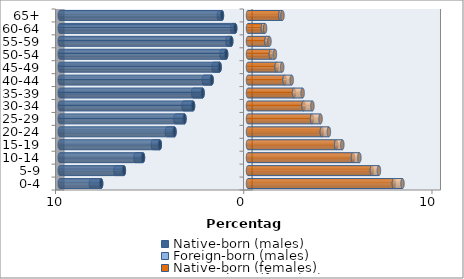
| Category | Native-born (males) | Foreign-born (males) | Native-born (females) | Foreign-born (females) |
|---|---|---|---|---|
| 0-4 | -7.802 | -0.546 | 7.749 | 0.458 |
| 5-9 | -6.594 | -0.447 | 6.578 | 0.377 |
| 10-14 | -5.58 | -0.4 | 5.576 | 0.341 |
| 15-19 | -4.685 | -0.369 | 4.684 | 0.328 |
| 20-24 | -3.905 | -0.405 | 3.922 | 0.376 |
| 25-29 | -3.375 | -0.482 | 3.402 | 0.452 |
| 30-34 | -2.92 | -0.507 | 2.951 | 0.47 |
| 35-39 | -2.413 | -0.5 | 2.443 | 0.458 |
| 40-44 | -1.93 | -0.415 | 1.941 | 0.379 |
| 45-49 | -1.507 | -0.323 | 1.523 | 0.294 |
| 50-54 | -1.161 | -0.246 | 1.215 | 0.216 |
| 55-59 | -0.89 | -0.199 | 0.978 | 0.162 |
| 60-64 | -0.68 | -0.16 | 0.79 | 0.117 |
| 65+ | -1.384 | -0.165 | 1.722 | 0.109 |